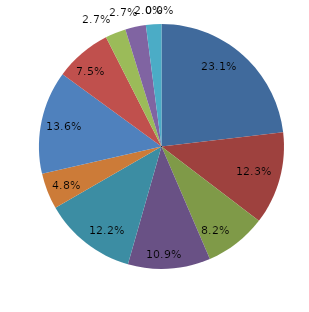
| Category | Series 0 |
|---|---|
| قبل الدخول | 23.129 |
| -1 | 12.245 |
| 1 | 8.163 |
| 2 | 10.884 |
| 3 | 12.245 |
| 4 | 4.762 |
|  5 - 9 | 13.605 |
|  10 - 14 | 7.483 |
|  15 - 19 | 2.721 |
|  20 - 24 | 2.721 |
| 25 + | 2.041 |
| غير مبين | 0 |